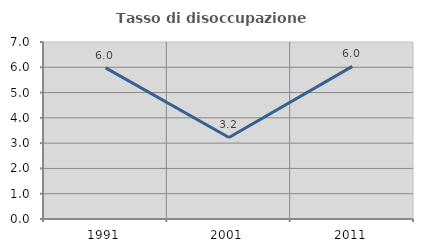
| Category | Tasso di disoccupazione giovanile  |
|---|---|
| 1991.0 | 5.978 |
| 2001.0 | 3.226 |
| 2011.0 | 6.034 |